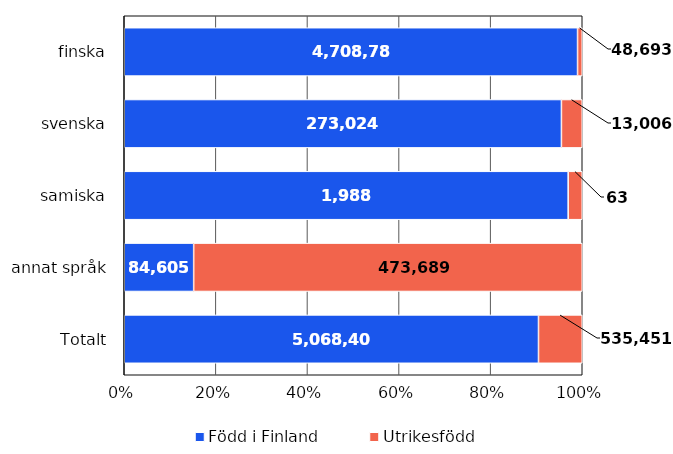
| Category | Född i Finland | Utrikesfödd |
|---|---|---|
| finska | 4708783 | 48693 |
| svenska | 273024 | 13006 |
| samiska | 1988 | 63 |
| annat språk | 84605 | 473689 |
| Totalt | 5068400 | 535451 |